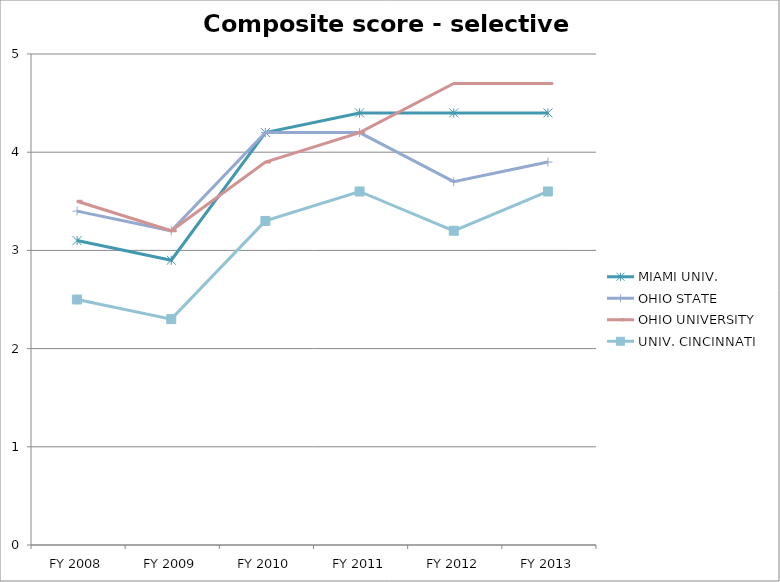
| Category | MIAMI UNIV.  | OHIO STATE  | OHIO UNIVERSITY  | UNIV. CINCINNATI  |
|---|---|---|---|---|
| FY 2013 | 4.4 | 3.9 | 4.7 | 3.6 |
| FY 2012 | 4.4 | 3.7 | 4.7 | 3.2 |
| FY 2011 | 4.4 | 4.2 | 4.2 | 3.6 |
| FY 2010 | 4.2 | 4.2 | 3.9 | 3.3 |
| FY 2009 | 2.9 | 3.2 | 3.2 | 2.3 |
| FY 2008 | 3.1 | 3.4 | 3.5 | 2.5 |